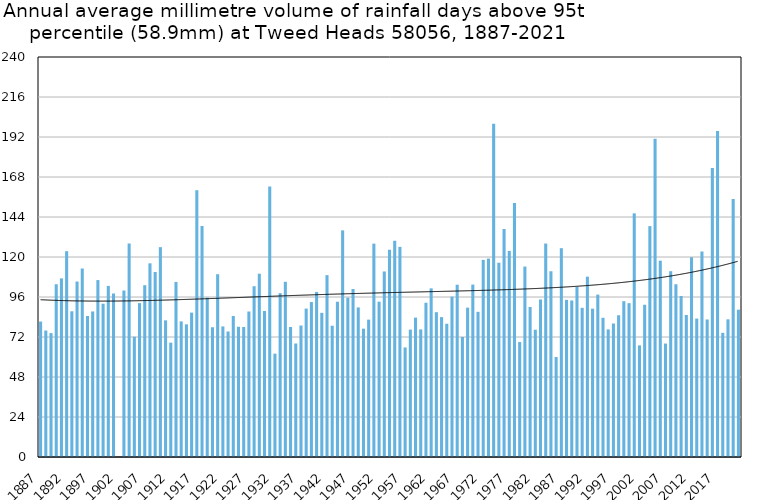
| Category | Annual average mm in days above 95th percentile |
|---|---|
| 1887 | 81.271 |
| 1888 | 75.9 |
| 1889 | 74.333 |
| 1890 | 103.656 |
| 1891 | 107.175 |
| 1892 | 123.48 |
| 1893 | 87.425 |
| 1894 | 105.29 |
| 1895 | 113.1 |
| 1896 | 84.58 |
| 1897 | 87.32 |
| 1898 | 106.143 |
| 1899 | 91.983 |
| 1900 | 102.65 |
| 1901 | 98.112 |
| 1902 | 0 |
| 1903 | 99.9 |
| 1904 | 128.1 |
| 1905 | 72.167 |
| 1906 | 92.317 |
| 1907 | 103.08 |
| 1908 | 116.2 |
| 1909 | 111 |
| 1910 | 125.9 |
| 1911 | 82 |
| 1912 | 68.6 |
| 1913 | 105.05 |
| 1914 | 81.367 |
| 1915 | 79.6 |
| 1916 | 86.633 |
| 1917 | 160.1 |
| 1918 | 138.6 |
| 1919 | 95.62 |
| 1920 | 77.857 |
| 1921 | 109.667 |
| 1922 | 78.34 |
| 1923 | 75.3 |
| 1924 | 84.62 |
| 1925 | 78.22 |
| 1926 | 78.014 |
| 1927 | 87.3 |
| 1928 | 102.467 |
| 1929 | 109.983 |
| 1930 | 87.567 |
| 1931 | 162.3 |
| 1932 | 62 |
| 1933 | 98.3 |
| 1934 | 105.14 |
| 1935 | 78 |
| 1936 | 68.1 |
| 1937 | 78.892 |
| 1938 | 89.04 |
| 1939 | 92.971 |
| 1940 | 99.05 |
| 1941 | 86.5 |
| 1942 | 109.117 |
| 1943 | 78.762 |
| 1944 | 93.16 |
| 1945 | 135.975 |
| 1946 | 95.6 |
| 1947 | 100.812 |
| 1948 | 89.75 |
| 1949 | 77 |
| 1950 | 82.425 |
| 1951 | 128.02 |
| 1952 | 93.186 |
| 1953 | 111.318 |
| 1954 | 124.3 |
| 1955 | 129.74 |
| 1956 | 126.089 |
| 1957 | 65.733 |
| 1958 | 76.44 |
| 1959 | 83.64 |
| 1960 | 76.55 |
| 1961 | 92.55 |
| 1962 | 101.188 |
| 1963 | 86.88 |
| 1964 | 83.95 |
| 1965 | 79.95 |
| 1966 | 96.2 |
| 1967 | 103.367 |
| 1968 | 72 |
| 1969 | 89.625 |
| 1970 | 103.443 |
| 1971 | 87.1 |
| 1972 | 118.283 |
| 1973 | 119.05 |
| 1974 | 199.878 |
| 1975 | 116.567 |
| 1976 | 136.8 |
| 1977 | 123.65 |
| 1978 | 152.467 |
| 1979 | 68.967 |
| 1980 | 114.25 |
| 1981 | 90 |
| 1982 | 76.36 |
| 1983 | 94.489 |
| 1984 | 128.071 |
| 1985 | 111.45 |
| 1986 | 60 |
| 1987 | 125.275 |
| 1988 | 94.277 |
| 1989 | 93.9 |
| 1990 | 102.044 |
| 1991 | 89.5 |
| 1992 | 108.2 |
| 1993 | 89 |
| 1994 | 97.44 |
| 1995 | 83.533 |
| 1996 | 76.567 |
| 1997 | 80.1 |
| 1998 | 85.05 |
| 1999 | 93.49 |
| 2000 | 92.3 |
| 2001 | 146.2 |
| 2002 | 66.96 |
| 2003 | 91.36 |
| 2004 | 138.525 |
| 2005 | 191 |
| 2006 | 117.8 |
| 2007 | 68.067 |
| 2008 | 111.48 |
| 2009 | 103.65 |
| 2010 | 96.6 |
| 2011 | 85.2 |
| 2012 | 119.88 |
| 2013 | 83.04 |
| 2014 | 123.3 |
| 2015 | 82.509 |
| 2016 | 173.4 |
| 2017 | 195.6 |
| 2018 | 74.5 |
| 2019 | 82.6 |
| 2020 | 154.733 |
| 2021 | 88.378 |